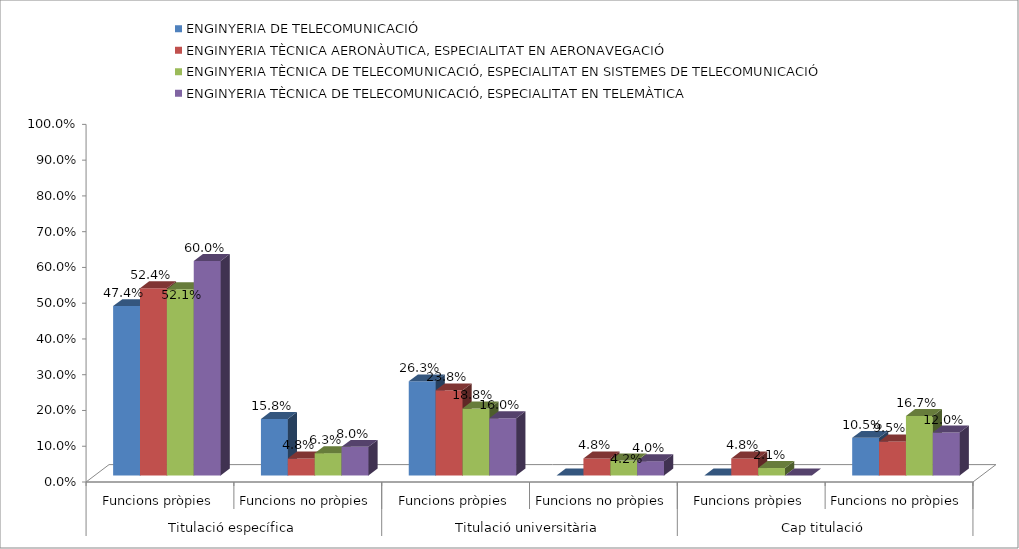
| Category | ENGINYERIA DE TELECOMUNICACIÓ | ENGINYERIA TÈCNICA AERONÀUTICA, ESPECIALITAT EN AERONAVEGACIÓ | ENGINYERIA TÈCNICA DE TELECOMUNICACIÓ, ESPECIALITAT EN SISTEMES DE TELECOMUNICACIÓ | ENGINYERIA TÈCNICA DE TELECOMUNICACIÓ, ESPECIALITAT EN TELEMÀTICA |
|---|---|---|---|---|
| 0 | 0.474 | 0.524 | 0.521 | 0.6 |
| 1 | 0.158 | 0.048 | 0.062 | 0.08 |
| 2 | 0.263 | 0.238 | 0.188 | 0.16 |
| 3 | 0 | 0.048 | 0.042 | 0.04 |
| 4 | 0 | 0.048 | 0.021 | 0 |
| 5 | 0.105 | 0.095 | 0.167 | 0.12 |